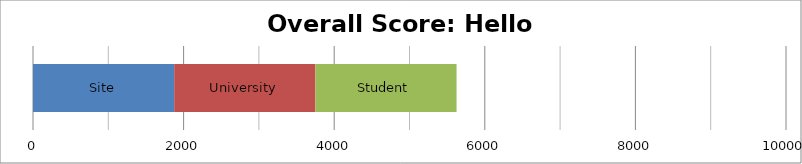
| Category | Site | University | Student |
|---|---|---|---|
| 0 | 1875 | 1875 | 1875 |